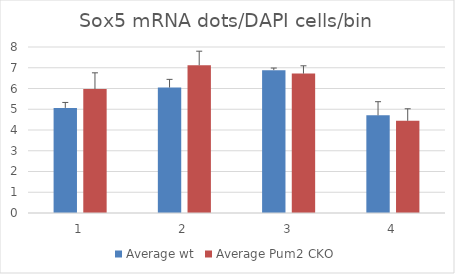
| Category | Average wt | Average Pum2 CKO |
|---|---|---|
| 0 | 5.066 | 5.974 |
| 1 | 6.046 | 7.118 |
| 2 | 6.885 | 6.718 |
| 3 | 4.705 | 4.44 |